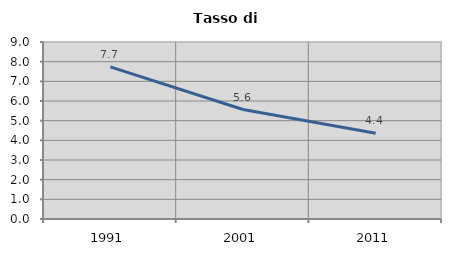
| Category | Tasso di disoccupazione   |
|---|---|
| 1991.0 | 7.738 |
| 2001.0 | 5.566 |
| 2011.0 | 4.359 |